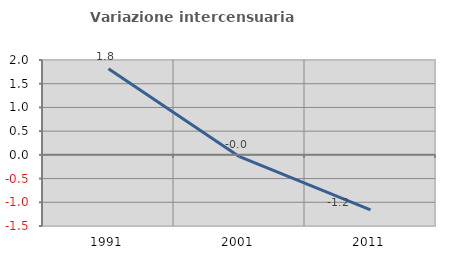
| Category | Variazione intercensuaria annua |
|---|---|
| 1991.0 | 1.816 |
| 2001.0 | -0.039 |
| 2011.0 | -1.161 |